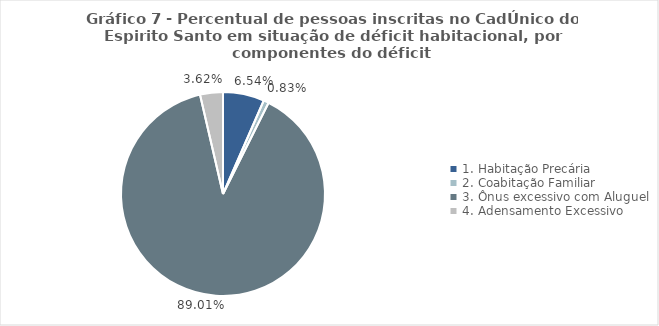
| Category | Series 0 | Series 1 |
|---|---|---|
| 1. Habitação Precária | 0.065 | 0.065 |
| 2. Coabitação Familiar | 0.008 | 0.008 |
| 3. Ônus excessivo com Aluguel | 0.89 | 0.89 |
| 4. Adensamento Excessivo | 0.036 | 0.036 |